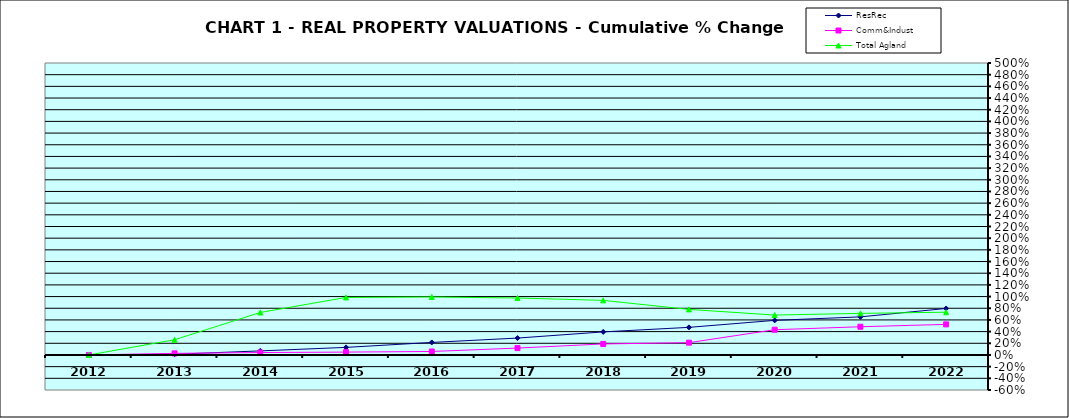
| Category | ResRec | Comm&Indust | Total Agland |
|---|---|---|---|
| 2012.0 | 0 | 0 | 0 |
| 2013.0 | 0.013 | 0.027 | 0.261 |
| 2014.0 | 0.07 | 0.041 | 0.728 |
| 2015.0 | 0.13 | 0.049 | 0.985 |
| 2016.0 | 0.215 | 0.06 | 0.993 |
| 2017.0 | 0.289 | 0.118 | 0.975 |
| 2018.0 | 0.395 | 0.189 | 0.935 |
| 2019.0 | 0.473 | 0.211 | 0.78 |
| 2020.0 | 0.592 | 0.432 | 0.684 |
| 2021.0 | 0.653 | 0.483 | 0.712 |
| 2022.0 | 0.796 | 0.524 | 0.732 |